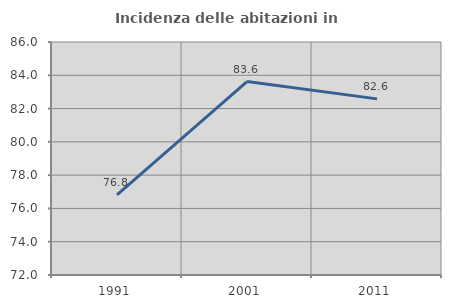
| Category | Incidenza delle abitazioni in proprietà  |
|---|---|
| 1991.0 | 76.811 |
| 2001.0 | 83.621 |
| 2011.0 | 82.582 |